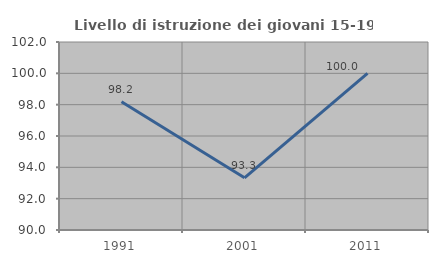
| Category | Livello di istruzione dei giovani 15-19 anni |
|---|---|
| 1991.0 | 98.182 |
| 2001.0 | 93.333 |
| 2011.0 | 100 |